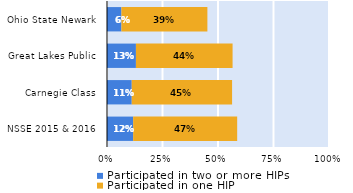
| Category | Participated in two or more HIPs | Participated in one HIP |
|---|---|---|
| NSSE 2015 & 2016 | 0.118 | 0.469 |
| Carnegie Class | 0.111 | 0.452 |
| Great Lakes Public | 0.13 | 0.435 |
| Ohio State Newark | 0.065 | 0.387 |